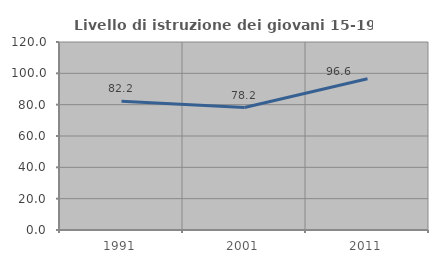
| Category | Livello di istruzione dei giovani 15-19 anni |
|---|---|
| 1991.0 | 82.192 |
| 2001.0 | 78.182 |
| 2011.0 | 96.552 |